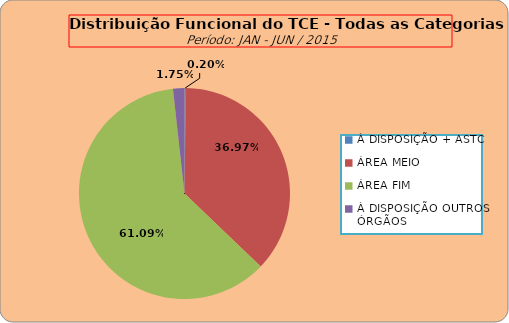
| Category | Series 0 |
|---|---|
| À DISPOSIÇÃO + ASTC | 1 |
| ÁREA MEIO | 190 |
| ÁREA FIM | 314 |
| À DISPOSIÇÃO OUTROS ÓRGÃOS | 9 |